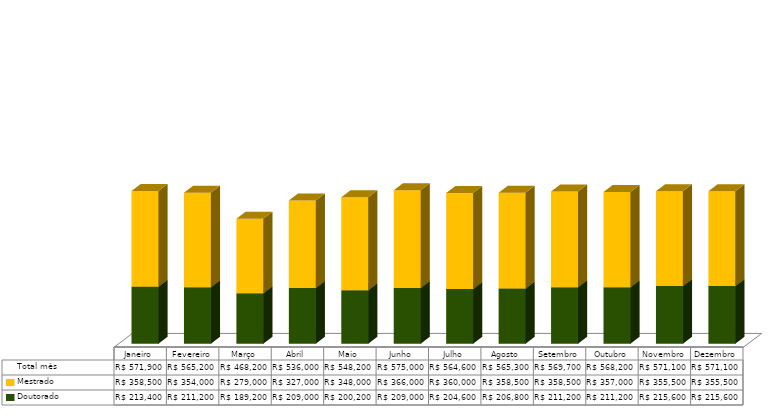
| Category | Doutorado                      | Mestrado                       | Total mês |
|---|---|---|---|
| Janeiro | 213400 | 358500 | 571900 |
| Fevereiro | 211200 | 354000 | 565200 |
| Março | 189200 | 279000 | 468200 |
| Abril | 209000 | 327000 | 536000 |
| Maio | 200200 | 348000 | 548200 |
| Junho | 209000 | 366000 | 575000 |
| Julho | 204600 | 360000 | 564600 |
| Agosto | 206800 | 358500 | 565300 |
| Setembro | 211200 | 358500 | 569700 |
| Outubro | 211200 | 357000 | 568200 |
| Novembro | 215600 | 355500 | 571100 |
| Dezembro | 215600 | 355500 | 571100 |